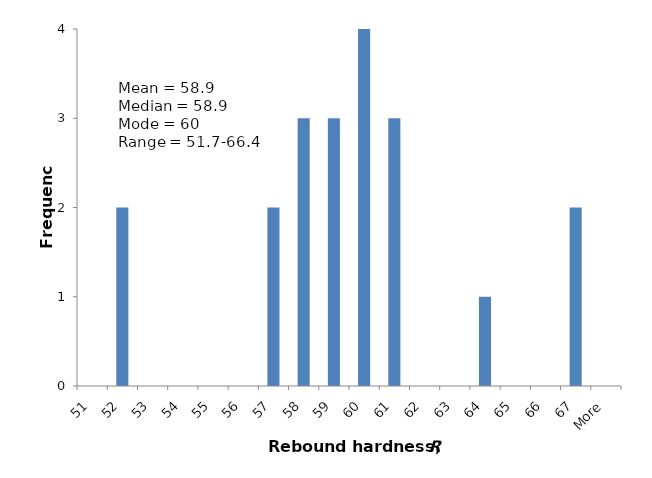
| Category | Frequency |
|---|---|
| 51 | 0 |
| 52 | 2 |
| 53 | 0 |
| 54 | 0 |
| 55 | 0 |
| 56 | 0 |
| 57 | 2 |
| 58 | 3 |
| 59 | 3 |
| 60 | 4 |
| 61 | 3 |
| 62 | 0 |
| 63 | 0 |
| 64 | 1 |
| 65 | 0 |
| 66 | 0 |
| 67 | 2 |
| More | 0 |